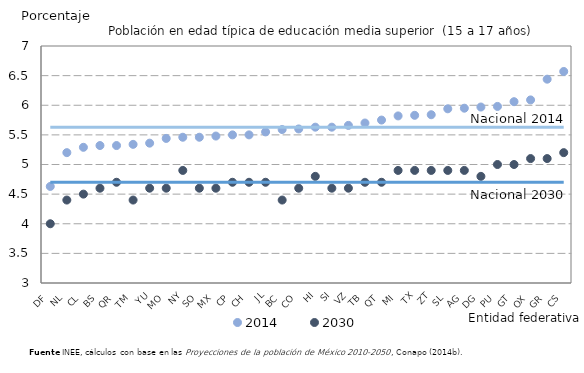
| Category | 2014 | 2030 | N_14 | N_30 |
|---|---|---|---|---|
| DF | 4.63 | 4 | 5.63 | 4.7 |
| NL | 5.2 | 4.4 | 5.63 | 4.7 |
| CL | 5.29 | 4.5 | 5.63 | 4.7 |
| BS | 5.32 | 4.6 | 5.63 | 4.7 |
| QR | 5.32 | 4.7 | 5.63 | 4.7 |
| TM | 5.34 | 4.4 | 5.63 | 4.7 |
| YU | 5.36 | 4.6 | 5.63 | 4.7 |
| MO | 5.44 | 4.6 | 5.63 | 4.7 |
| NY | 5.46 | 4.9 | 5.63 | 4.7 |
| SO | 5.46 | 4.6 | 5.63 | 4.7 |
| MX | 5.48 | 4.6 | 5.63 | 4.7 |
| CP | 5.5 | 4.7 | 5.63 | 4.7 |
| CH | 5.5 | 4.7 | 5.63 | 4.7 |
| JL | 5.55 | 4.7 | 5.63 | 4.7 |
| BC | 5.59 | 4.4 | 5.63 | 4.7 |
| CO | 5.6 | 4.6 | 5.63 | 4.7 |
| HI | 5.63 | 4.8 | 5.63 | 4.7 |
| SI | 5.63 | 4.6 | 5.63 | 4.7 |
| VZ | 5.66 | 4.6 | 5.63 | 4.7 |
| TB | 5.7 | 4.7 | 5.63 | 4.7 |
| QT | 5.75 | 4.7 | 5.63 | 4.7 |
| MI | 5.82 | 4.9 | 5.63 | 4.7 |
| TX | 5.83 | 4.9 | 5.63 | 4.7 |
| ZT | 5.84 | 4.9 | 5.63 | 4.7 |
| SL | 5.94 | 4.9 | 5.63 | 4.7 |
| AG | 5.95 | 4.9 | 5.63 | 4.7 |
| DG | 5.97 | 4.8 | 5.63 | 4.7 |
| PU | 5.98 | 5 | 5.63 | 4.7 |
| GT | 6.06 | 5 | 5.63 | 4.7 |
| OX | 6.09 | 5.1 | 5.63 | 4.7 |
| GR | 6.44 | 5.1 | 5.63 | 4.7 |
| CS | 6.57 | 5.2 | 5.63 | 4.7 |